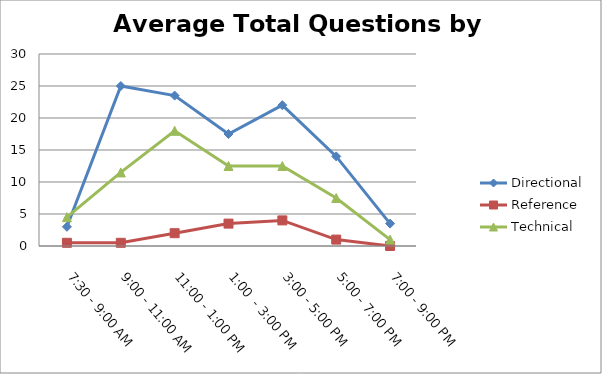
| Category | Directional | Reference | Technical |
|---|---|---|---|
| 7:30 - 9:00 AM | 3 | 0.5 | 4.5 |
| 9:00 - 11:00 AM | 25 | 0.5 | 11.5 |
| 11:00 - 1:00 PM | 23.5 | 2 | 18 |
| 1:00  - 3:00 PM | 17.5 | 3.5 | 12.5 |
| 3:00 - 5:00 PM | 22 | 4 | 12.5 |
| 5:00 - 7:00 PM | 14 | 1 | 7.5 |
| 7:00 - 9:00 PM | 3.5 | 0 | 1 |